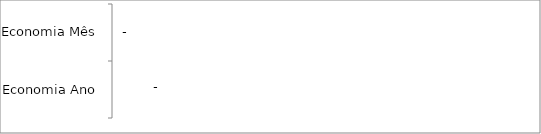
| Category | Series 0 |
|---|---|
| Economia Ano | 0 |
| Economia Mês | 0 |